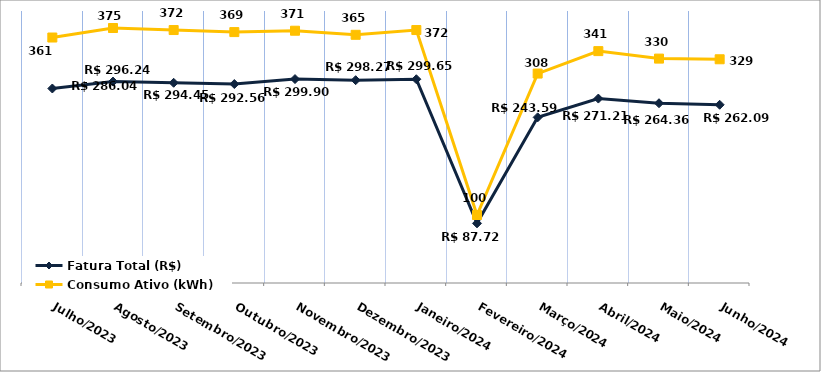
| Category | Fatura Total (R$) |
|---|---|
| Julho/2023 | 286.04 |
| Agosto/2023 | 296.24 |
| Setembro/2023 | 294.45 |
| Outubro/2023 | 292.56 |
| Novembro/2023 | 299.9 |
| Dezembro/2023 | 298.27 |
| Janeiro/2024 | 299.65 |
| Fevereiro/2024 | 87.72 |
| Março/2024 | 243.59 |
| Abril/2024 | 271.21 |
| Maio/2024 | 264.36 |
| Junho/2024 | 262.09 |